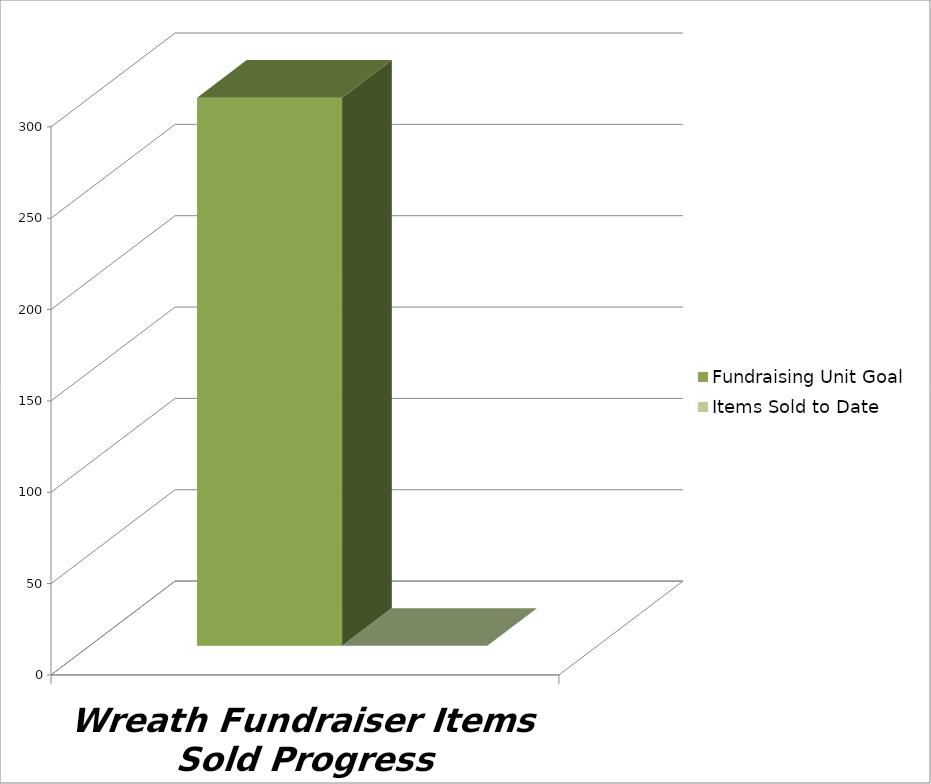
| Category | Fundraising Unit Goal | Items Sold to Date |
|---|---|---|
| 0 | 300 | 0 |